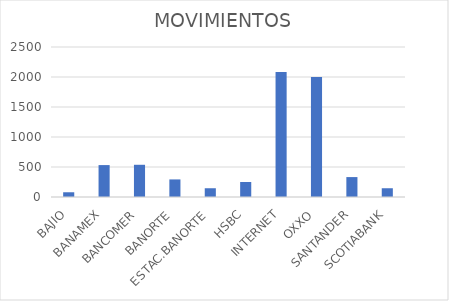
| Category | MOVIMIENTOS |
|---|---|
| BAJIO | 79 |
| BANAMEX | 532 |
| BANCOMER | 537 |
| BANORTE | 293 |
| ESTAC.BANORTE | 146 |
| HSBC | 250 |
| INTERNET | 2083 |
| OXXO | 1998 |
| SANTANDER | 332 |
| SCOTIABANK | 146 |